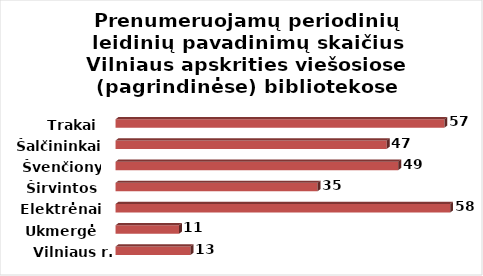
| Category | Series 0 |
|---|---|
| Vilniaus r. | 13 |
| Ukmergė | 11 |
| Elektrėnai | 58 |
| Širvintos | 35 |
| Švenčionys | 49 |
| Šalčininkai | 47 |
| Trakai | 57 |